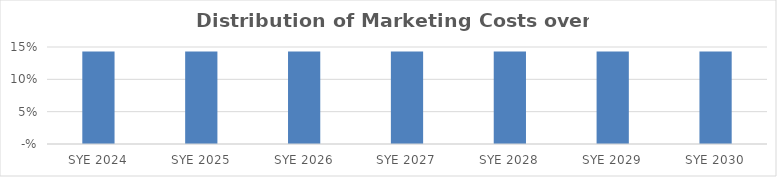
| Category | Series 0 |
|---|---|
| 2024.0 | 0.143 |
| 2025.0 | 0.143 |
| 2026.0 | 0.143 |
| 2027.0 | 0.143 |
| 2028.0 | 0.143 |
| 2029.0 | 0.143 |
| 2030.0 | 0.143 |